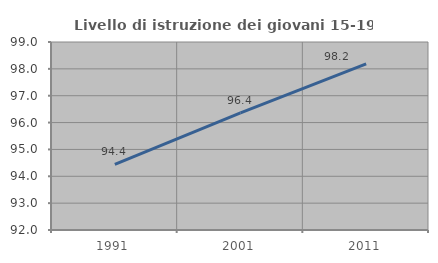
| Category | Livello di istruzione dei giovani 15-19 anni |
|---|---|
| 1991.0 | 94.444 |
| 2001.0 | 96.364 |
| 2011.0 | 98.182 |